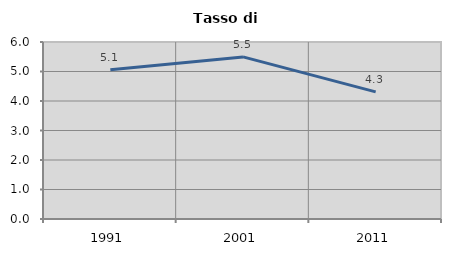
| Category | Tasso di disoccupazione   |
|---|---|
| 1991.0 | 5.056 |
| 2001.0 | 5.495 |
| 2011.0 | 4.31 |